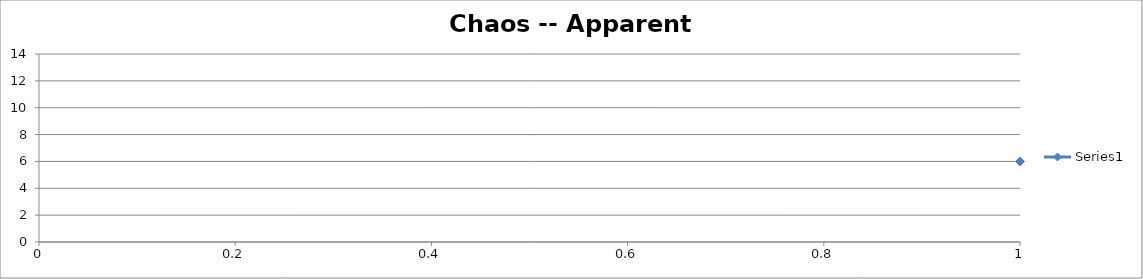
| Category | Series 0 |
|---|---|
| 0 | 6 |
| 1 | 12.96 |
| 2 | 1.835 |
| 3 | 6.18 |
| 4 | 13.026 |
| 5 | 1.594 |
| 6 | 5.48 |
| 7 | 12.663 |
| 8 | 2.884 |
| 9 | 8.835 |
| 10 | 11.819 |
| 11 | 5.583 |
| 12 | 12.735 |
| 13 | 2.636 |
| 14 | 8.265 |
| 15 | 12.424 |
| 16 | 3.691 |
| 17 | 10.444 |
| 18 | 9.1 |
| 19 | 11.475 |
| 20 | 6.566 |
| 21 | 13.105 |
| 22 | 1.305 |
| 23 | 4.597 |
| 24 | 11.8 |
| 25 | 5.641 |
| 26 | 12.772 |
| 27 | 2.506 |
| 28 | 7.952 |
| 29 | 12.675 |
| 30 | 2.842 |
| 31 | 8.741 |
| 32 | 11.932 |
| 33 | 5.247 |
| 34 | 12.479 |
| 35 | 3.506 |
| 36 | 10.11 |
| 37 | 9.788 |
| 38 | 10.389 |
| 39 | 9.216 |
| 40 | 11.311 |
| 41 | 7.011 |
| 42 | 13.088 |
| 43 | 1.367 |
| 44 | 4.789 |
| 45 | 12.026 |
| 46 | 4.96 |
| 47 | 12.21 |
| 48 | 4.386 |
| 49 | 11.527 |
| 50 | 6.423 |
| 51 | 13.086 |
| 52 | 1.376 |
| 53 | 4.817 |
| 54 | 12.057 |
| 55 | 4.864 |
| 56 | 12.109 |
| 57 | 4.703 |
| 58 | 11.928 |
| 59 | 5.259 |
| 60 | 12.49 |
| 61 | 3.472 |
| 62 | 10.045 |
| 63 | 9.913 |
| 64 | 10.163 |
| 65 | 9.684 |
| 66 | 10.572 |
| 67 | 8.818 |
| 68 | 11.841 |
| 69 | 5.52 |
| 70 | 12.692 |
| 71 | 2.785 |
| 72 | 8.612 |
| 73 | 12.079 |
| 74 | 4.797 |
| 75 | 12.035 |
| 76 | 4.934 |
| 77 | 12.182 |
| 78 | 4.473 |
| 79 | 11.642 |
| 80 | 6.098 |
| 81 | 12.998 |
| 82 | 1.696 |
| 83 | 5.781 |
| 84 | 12.854 |
| 85 | 2.216 |
| 86 | 7.217 |
| 87 | 13.042 |
| 88 | 1.538 |
| 89 | 5.313 |
| 90 | 12.534 |
| 91 | 3.322 |
| 92 | 9.756 |
| 93 | 10.447 |
| 94 | 9.093 |
| 95 | 11.485 |